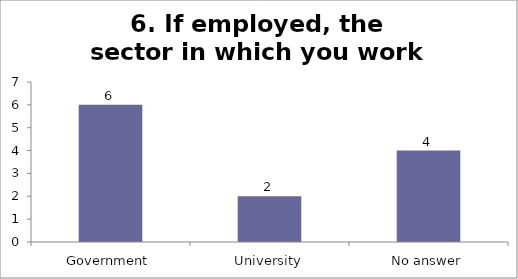
| Category | 6. If employed, the sector in which you work |
|---|---|
| Government | 6 |
| University | 2 |
| No answer | 4 |